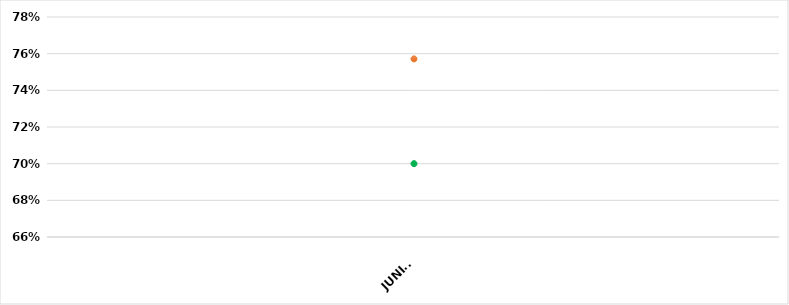
| Category | VALOR  | META PONDERADA |
|---|---|---|
| JUNIO | 0.757 | 0.7 |